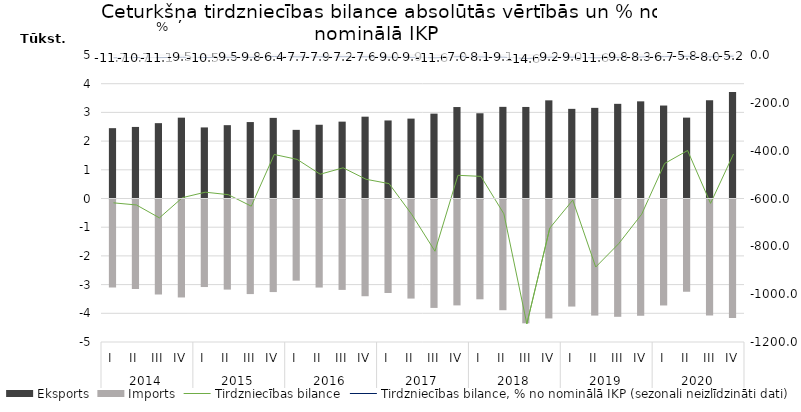
| Category | Eksports | Imports |
|---|---|---|
| 0 | 2450.7 | -3068.8 |
| 1 | 2493.4 | -3120.5 |
| 2 | 2625.5 | -3306.5 |
| 3 | 2816.7 | -3413.2 |
| 4 | 2476.5 | -3050.1 |
| 5 | 2555.2 | -3139.2 |
| 6 | 2663.4 | -3295.5 |
| 7 | 2809.5 | -3225.4 |
| 8 | 2391.5 | -2828.1 |
| 9 | 2569.5 | -3068 |
| 10 | 2678.2 | -3149.9 |
| 11 | 2850.8 | -3370.5 |
| 12 | 2719.6 | -3257.4 |
| 13 | 2783.8 | -3452 |
| 14 | 2956.9 | -3777.4 |
| 15 | 3187 | -3690 |
| 16 | 2969.9 | -3477.4 |
| 17 | 3193.3 | -3857.4 |
| 18 | 3189.7 | -4313.9 |
| 19 | 3420.5 | -4144.2 |
| 20 | 3123.6 | -3730.2 |
| 21 | 3158.2 | -4044.8 |
| 22 | 3298.5 | -4087.5 |
| 23 | 3385.3 | -4051.1 |
| 24 | 3239 | -3692.6 |
| 25 | 2818 | -3217.4 |
| 26 | 3421.3 | -4041.6 |
| 27 | 3711.4 | -4125.4 |